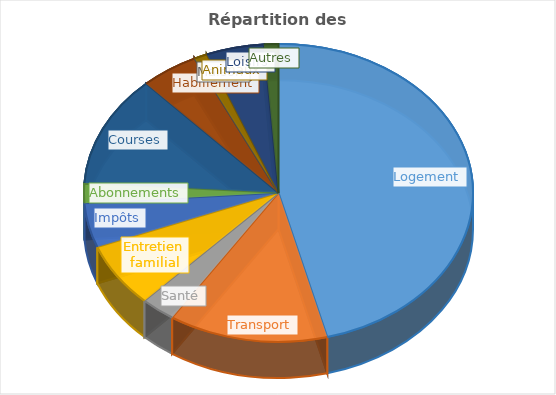
| Category | Series 0 | Series 1 |
|---|---|---|
| Logement |  | 1910 |
| Transport |  | 550 |
| Santé |  | 120 |
| Entretien familial |  | 290 |
| Impôts |  | 200 |
| Abonnements |  | 90 |
| Courses |  | 500 |
| Habillement |  | 200 |
| Maison |  | 0 |
| Animaux |  | 45 |
| Loisirs |  | 200 |
| Autres |  | 50 |